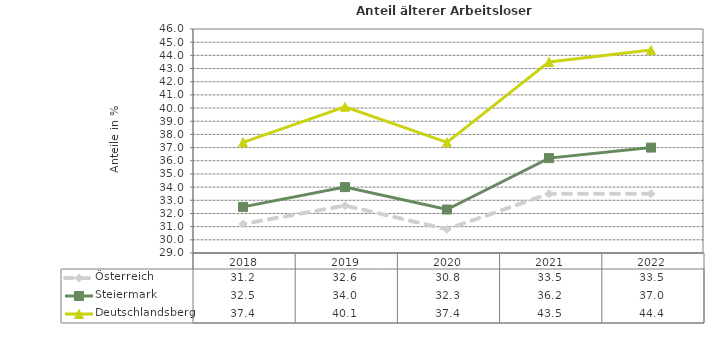
| Category | Österreich | Steiermark | Deutschlandsberg |
|---|---|---|---|
| 2022.0 | 33.5 | 37 | 44.4 |
| 2021.0 | 33.5 | 36.2 | 43.5 |
| 2020.0 | 30.8 | 32.3 | 37.4 |
| 2019.0 | 32.6 | 34 | 40.1 |
| 2018.0 | 31.2 | 32.5 | 37.4 |